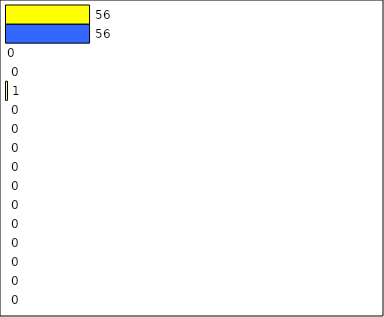
| Category | -2 | -1 | 0 | 1 | 2 | 3 | 4 | 5 | 6 | 7 | 8 | 9 | 10 | 11 | 12 | Perfect Round |
|---|---|---|---|---|---|---|---|---|---|---|---|---|---|---|---|---|
| 0 | 0 | 0 | 0 | 0 | 0 | 0 | 0 | 0 | 0 | 0 | 0 | 1 | 0 | 0 | 56 | 56 |